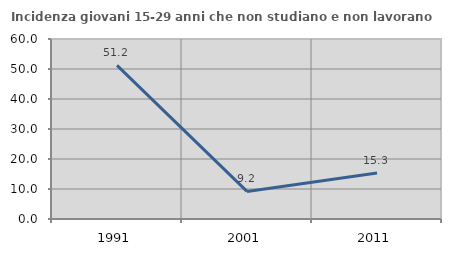
| Category | Incidenza giovani 15-29 anni che non studiano e non lavorano  |
|---|---|
| 1991.0 | 51.224 |
| 2001.0 | 9.197 |
| 2011.0 | 15.308 |